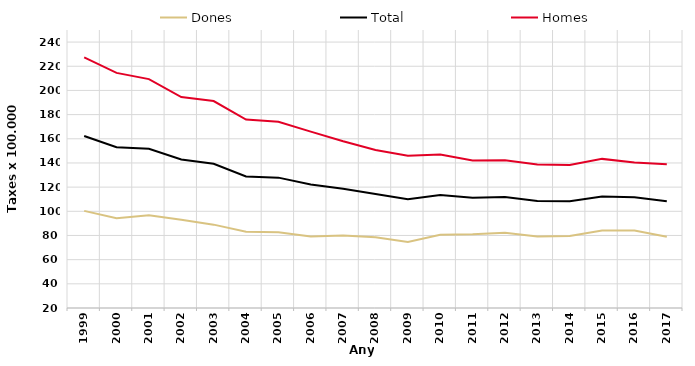
| Category | Dones | Total | Homes |
|---|---|---|---|
| 1999.0 | 100.369 | 162.334 | 227.287 |
| 2000.0 | 94.199 | 152.967 | 214.509 |
| 2001.0 | 96.716 | 151.791 | 209.347 |
| 2002.0 | 93.009 | 142.839 | 194.498 |
| 2003.0 | 88.969 | 139.297 | 191.243 |
| 2004.0 | 83.071 | 128.821 | 175.871 |
| 2005.0 | 82.706 | 127.851 | 174.074 |
| 2006.0 | 79.223 | 122.119 | 165.926 |
| 2007.0 | 79.94 | 118.591 | 157.971 |
| 2008.0 | 78.549 | 114.311 | 150.673 |
| 2009.0 | 74.61 | 109.95 | 145.93 |
| 2010.0 | 80.54 | 113.41 | 146.98 |
| 2011.0 | 81.03 | 111.12 | 141.96 |
| 2012.0 | 82.27 | 111.88 | 142.29 |
| 2013.0 | 79.12 | 108.48 | 138.81 |
| 2014.0 | 79.6 | 108.41 | 138.28 |
| 2015.0 | 84.19 | 112.26 | 143.37 |
| 2016.0 | 84.11 | 111.68 | 140.36 |
| 2017.0 | 78.88 | 108.27 | 138.89 |